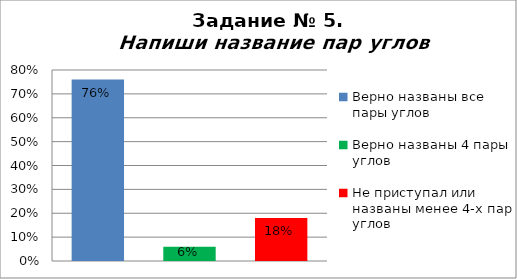
| Category | Напиши название пар углов |
|---|---|
| Верно названы все пары углов | 0.76 |
| Верно названы 4 пары углов | 0.06 |
| Не приступал или названы менее 4-х пар углов | 0.18 |